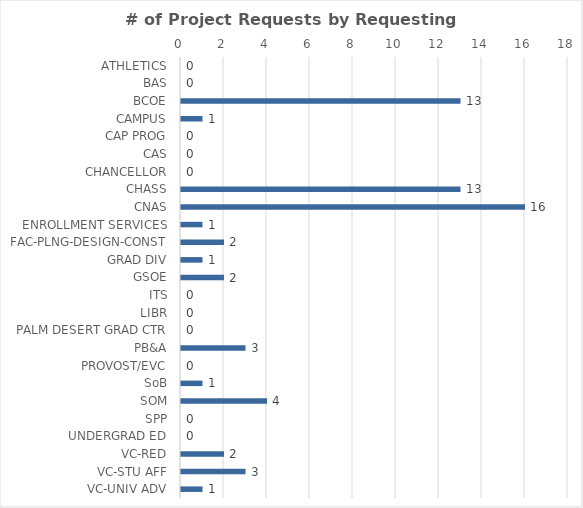
| Category | Series 9 |
|---|---|
| ATHLETICS | 0 |
| BAS | 0 |
| BCOE | 13 |
| CAMPUS | 1 |
| CAP PROG | 0 |
| CAS | 0 |
| CHANCELLOR | 0 |
| CHASS | 13 |
| CNAS | 16 |
| ENROLLMENT SERVICES | 1 |
| FAC-PLNG-DESIGN-CONST | 2 |
| GRAD DIV | 1 |
| GSOE | 2 |
| ITS | 0 |
| LIBR | 0 |
| PALM DESERT GRAD CTR | 0 |
| PB&A | 3 |
| PROVOST/EVC | 0 |
| SoB | 1 |
| SOM | 4 |
| SPP | 0 |
| UNDERGRAD ED | 0 |
| VC-RED | 2 |
| VC-STU AFF | 3 |
| VC-UNIV ADV | 1 |